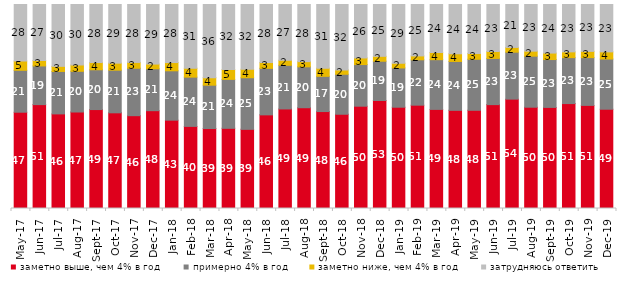
| Category | заметно выше, чем 4% в год | примерно 4% в год | заметно ниже, чем 4% в год | затрудняюсь ответить |
|---|---|---|---|---|
| 2017-05-01 | 47.2 | 20.55 | 4.55 | 27.7 |
| 2017-06-01 | 50.9 | 18.95 | 2.65 | 27.45 |
| 2017-07-01 | 46.35 | 20.8 | 2.5 | 30.3 |
| 2017-08-01 | 47.3 | 19.95 | 3.1 | 29.65 |
| 2017-09-01 | 48.5 | 19.5 | 3.55 | 28.45 |
| 2017-10-01 | 46.9 | 20.9 | 3.45 | 28.75 |
| 2017-11-01 | 45.5 | 23.25 | 2.85 | 28.4 |
| 2017-12-01 | 47.95 | 20.55 | 2.3 | 29.2 |
| 2018-01-01 | 43.3 | 24.2 | 4.05 | 28.45 |
| 2018-02-01 | 40.25 | 24.15 | 4.35 | 31.25 |
| 2018-03-01 | 39.2 | 21.25 | 3.7 | 35.85 |
| 2018-04-01 | 39.3 | 24 | 4.85 | 31.85 |
| 2018-05-01 | 38.8 | 25.3 | 4.15 | 31.75 |
| 2018-06-01 | 45.9 | 22.8 | 2.85 | 28.45 |
| 2018-07-01 | 48.8 | 21.4 | 2.45 | 27.35 |
| 2018-08-01 | 49.4 | 20.05 | 2.55 | 28 |
| 2018-09-01 | 47.5 | 17.25 | 4 | 31.2 |
| 2018-10-01 | 46.2 | 19.6 | 2.15 | 32.05 |
| 2018-11-01 | 50.15 | 20.409 | 3.244 | 26.198 |
| 2018-12-01 | 52.95 | 19.25 | 2.4 | 25.4 |
| 2019-01-01 | 49.65 | 19.25 | 2.3 | 28.8 |
| 2019-02-01 | 50.65 | 22.25 | 1.9 | 25.2 |
| 2019-03-01 | 48.583 | 24.366 | 3.531 | 23.521 |
| 2019-04-01 | 48.119 | 23.96 | 3.762 | 24.158 |
| 2019-05-01 | 48.143 | 25.012 | 2.823 | 24.022 |
| 2019-06-01 | 50.923 | 22.643 | 3.392 | 23.042 |
| 2019-07-01 | 53.614 | 23.02 | 2.327 | 21.04 |
| 2019-08-01 | 49.65 | 25.025 | 2.448 | 22.877 |
| 2019-09-01 | 49.554 | 23.465 | 3.168 | 23.812 |
| 2019-10-01 | 51.436 | 22.525 | 2.822 | 23.218 |
| 2019-11-01 | 50.545 | 23.416 | 3.069 | 22.97 |
| 2019-12-01 | 48.663 | 24.604 | 3.515 | 23.218 |